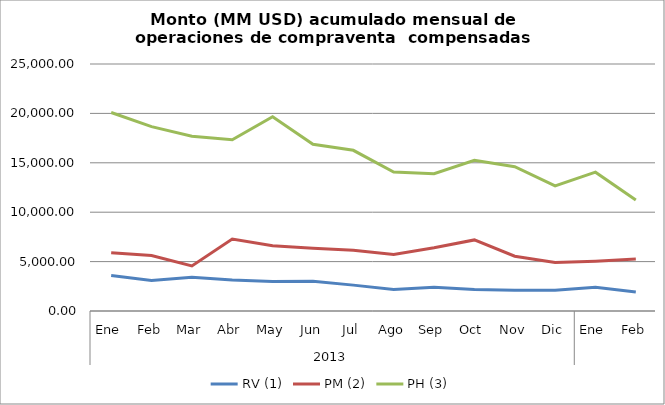
| Category | RV (1) | PM (2) | PH (3) |
|---|---|---|---|
| 0 | 3582.113 | 5901.651 | 20087.034 |
| 1 | 3086.223 | 5614.086 | 18662.914 |
| 2 | 3427.503 | 4559.027 | 17696.541 |
| 3 | 3146.302 | 7279.906 | 17332.385 |
| 4 | 2992.826 | 6596.857 | 19663.42 |
| 5 | 3012.804 | 6346.526 | 16878.408 |
| 6 | 2618.878 | 6139.885 | 16263.385 |
| 7 | 2182.732 | 5724.829 | 14069.305 |
| 8 | 2409.674 | 6399.577 | 13889.23 |
| 9 | 2180.079 | 7195.606 | 15254.774 |
| 10 | 2095.442 | 5541.836 | 14598.61 |
| 11 | 2104.88 | 4905.995 | 12657.524 |
| 12 | 2410.581 | 5047.1 | 14052.921 |
| 13 | 1913.3 | 5251.955 | 11240.27 |